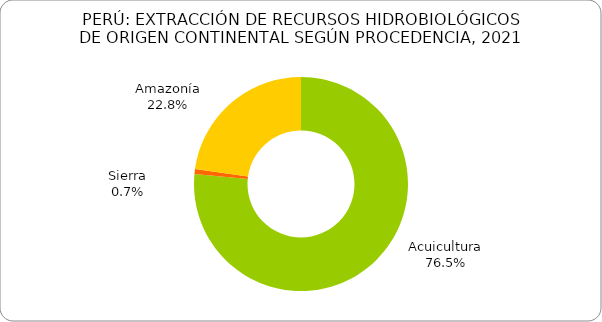
| Category | Series 0 |
|---|---|
| Acuicultura | 0.765 |
| Sierra | 0.007 |
| Amazonía | 0.228 |